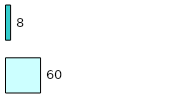
| Category | Series 0 | Series 1 |
|---|---|---|
| 0 | 60 | 8 |